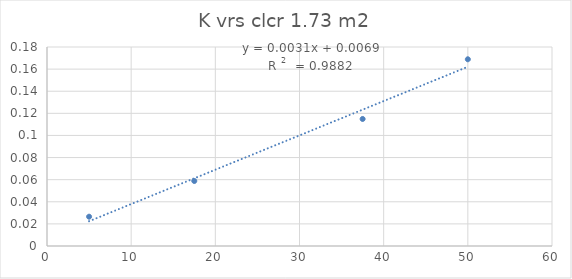
| Category | Series 0 |
|---|---|
| 50.0 | 0.169 |
| 37.5 | 0.115 |
| 17.5 | 0.059 |
| 5.0 | 0.026 |